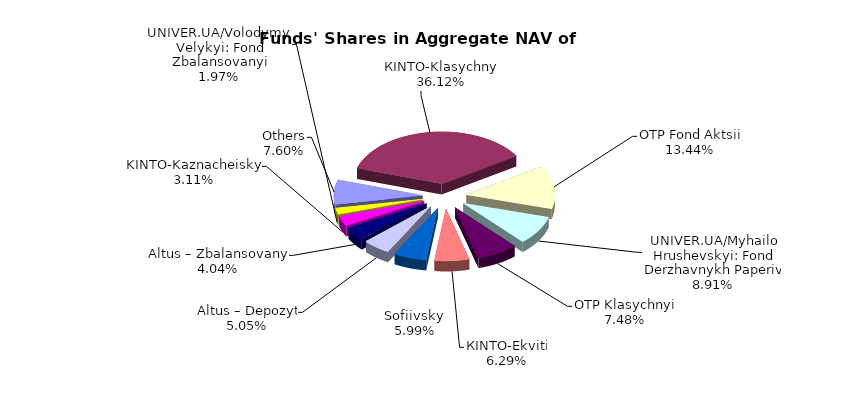
| Category | Series 0 | Series 1 |
|---|---|---|
| Others | 6388368.01 | 0.074 |
| КІNТО-Klasychnyi | 30356369.46 | 0.353 |
| OTP Fond Aktsii | 11297008.71 | 0.132 |
| UNIVER.UA/Myhailo Hrushevskyi: Fond Derzhavnykh Paperiv | 7492065.29 | 0.087 |
| OTP Klasychnyi' | 6289914.48 | 0.073 |
| КІNTO-Ekviti | 5287470.7 | 0.062 |
| Sofiivskyi | 5031478.22 | 0.059 |
| Altus – Depozyt | 4248685.61 | 0.049 |
| Altus – Zbalansovanyi | 3394082.58 | 0.04 |
| KINTO-Kaznacheiskyi | 2612483.48 | 0.03 |
| UNIVER.UA/Volodymyr Velykyi: Fond Zbalansovanyi | 1655772.46 | 0.019 |